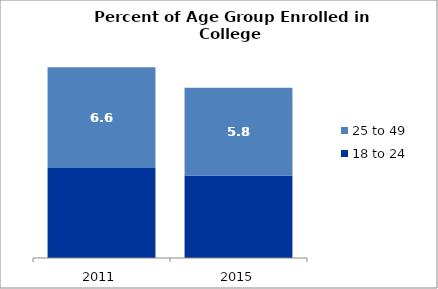
| Category | 18 to 24 | 25 to 49 |
|---|---|---|
| 2011.0 | 37.948 | 6.644 |
| 2015.0 | 37.449 | 5.8 |